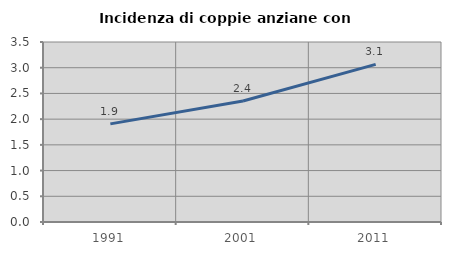
| Category | Incidenza di coppie anziane con figli |
|---|---|
| 1991.0 | 1.908 |
| 2001.0 | 2.353 |
| 2011.0 | 3.065 |